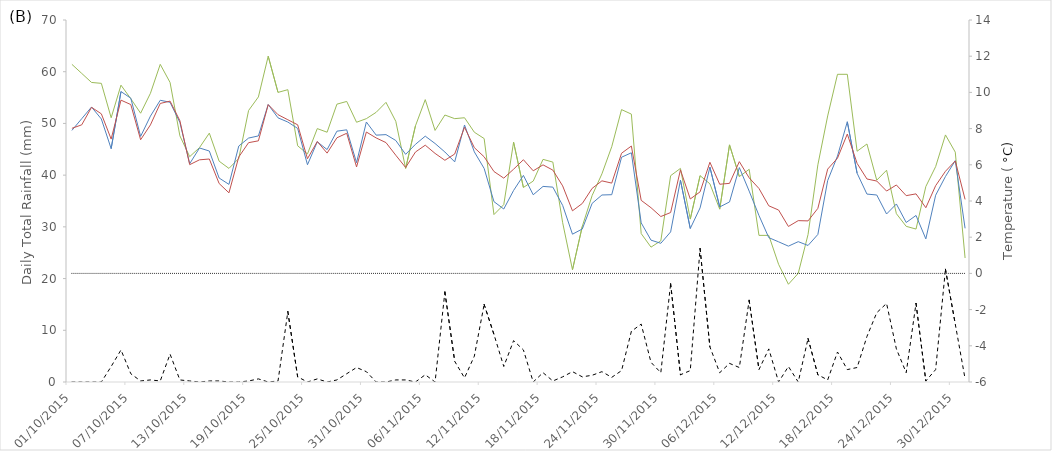
| Category | Daily Total Rainfall (mm) |
|---|---|
| 01/10/2015 | 0 |
| 02/10/2015 | 0 |
| 03/10/2015 | 0 |
| 04/10/2015 | 0 |
| 05/10/2015 | 3 |
| 06/10/2015 | 6.2 |
| 07/10/2015 | 1.6 |
| 08/10/2015 | 0.2 |
| 09/10/2015 | 0.4 |
| 10/10/2015 | 0.2 |
| 11/10/2015 | 5.4 |
| 12/10/2015 | 0.4 |
| 13/10/2015 | 0.2 |
| 14/10/2015 | 0 |
| 15/10/2015 | 0.2 |
| 16/10/2015 | 0.2 |
| 17/10/2015 | 0 |
| 18/10/2015 | 0 |
| 19/10/2015 | 0.2 |
| 20/10/2015 | 0.6 |
| 21/10/2015 | 0 |
| 22/10/2015 | 0.2 |
| 23/10/2015 | 13.6 |
| 24/10/2015 | 1 |
| 25/10/2015 | 0 |
| 26/10/2015 | 0.6 |
| 27/10/2015 | 0 |
| 28/10/2015 | 0.4 |
| 29/10/2015 | 1.6 |
| 30/10/2015 | 2.8 |
| 31/10/2015 | 2 |
| 01/11/2015 | 0 |
| 02/11/2015 | 0 |
| 03/11/2015 | 0.4 |
| 04/11/2015 | 0.4 |
| 05/11/2015 | 0 |
| 06/11/2015 | 1.4 |
| 07/11/2015 | 0 |
| 08/11/2015 | 17.4 |
| 09/11/2015 | 4 |
| 10/11/2015 | 0.8 |
| 11/11/2015 | 5 |
| 12/11/2015 | 15 |
| 13/11/2015 | 9.2 |
| 14/11/2015 | 3 |
| 15/11/2015 | 8 |
| 16/11/2015 | 6.2 |
| 17/11/2015 | 0 |
| 18/11/2015 | 1.8 |
| 19/11/2015 | 0.2 |
| 20/11/2015 | 1 |
| 21/11/2015 | 2 |
| 22/11/2015 | 1 |
| 23/11/2015 | 1.3 |
| 24/11/2015 | 2 |
| 25/11/2015 | 0.9 |
| 26/11/2015 | 2.2 |
| 27/11/2015 | 9.8 |
| 28/11/2015 | 11.2 |
| 29/11/2015 | 3.8 |
| 30/11/2015 | 1.8 |
| 01/12/2015 | 19 |
| 02/12/2015 | 1.4 |
| 03/12/2015 | 2.2 |
| 04/12/2015 | 25.8 |
| 05/12/2015 | 6.8 |
| 06/12/2015 | 1.8 |
| 07/12/2015 | 3.6 |
| 08/12/2015 | 2.8 |
| 09/12/2015 | 15.8 |
| 10/12/2015 | 2.4 |
| 11/12/2015 | 6.4 |
| 12/12/2015 | 0 |
| 13/12/2015 | 3 |
| 14/12/2015 | 0 |
| 15/12/2015 | 8.4 |
| 16/12/2015 | 1.4 |
| 17/12/2015 | 0.4 |
| 18/12/2015 | 5.8 |
| 19/12/2015 | 2.4 |
| 20/12/2015 | 2.8 |
| 21/12/2015 | 8.8 |
| 22/12/2015 | 13.4 |
| 23/12/2015 | 15.2 |
| 24/12/2015 | 6.4 |
| 25/12/2015 | 1.8 |
| 26/12/2015 | 15.2 |
| 27/12/2015 | 0.2 |
| 28/12/2015 | 2.4 |
| 29/12/2015 | 21.8 |
| 30/12/2015 | 11.2 |
| 31/12/2015 | 0.6 |